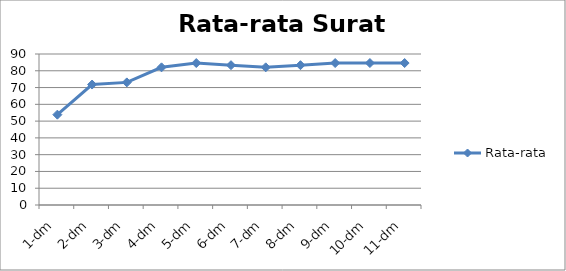
| Category | Rata-rata |
|---|---|
| 1-dm | 53.846 |
| 2-dm | 71.795 |
| 3-dm | 73.077 |
| 4-dm | 82.051 |
| 5-dm | 84.615 |
| 6-dm | 83.333 |
| 7-dm | 82.051 |
| 8-dm | 83.333 |
| 9-dm | 84.615 |
| 10-dm | 84.615 |
| 11-dm | 84.615 |